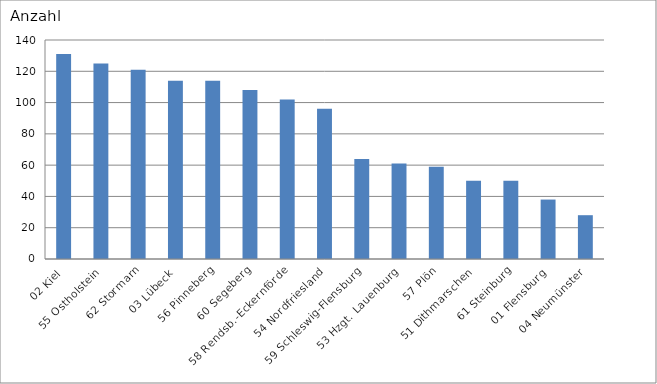
| Category | 02 Kiel 55 Ostholstein 62 Stormarn 03 Lübeck 56 Pinneberg 60 Segeberg 58 Rendsb.-Eckernförde 54 Nordfriesland 59 Schleswig-Flensburg 53 Hzgt. Lauenburg 57 Plön 51 Dithmarschen 61 Steinburg 01 Flensburg 04 Neumünster |
|---|---|
| 02 Kiel | 131 |
| 55 Ostholstein | 125 |
| 62 Stormarn | 121 |
| 03 Lübeck | 114 |
| 56 Pinneberg | 114 |
| 60 Segeberg | 108 |
| 58 Rendsb.-Eckernförde | 102 |
| 54 Nordfriesland | 96 |
| 59 Schleswig-Flensburg | 64 |
| 53 Hzgt. Lauenburg | 61 |
| 57 Plön | 59 |
| 51 Dithmarschen | 50 |
| 61 Steinburg | 50 |
| 01 Flensburg | 38 |
| 04 Neumünster | 28 |